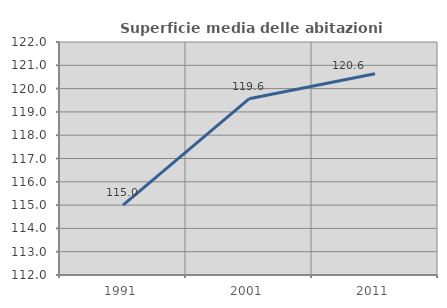
| Category | Superficie media delle abitazioni occupate |
|---|---|
| 1991.0 | 114.996 |
| 2001.0 | 119.561 |
| 2011.0 | 120.636 |